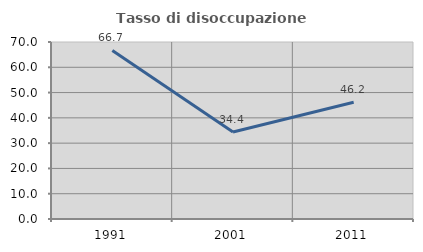
| Category | Tasso di disoccupazione giovanile  |
|---|---|
| 1991.0 | 66.667 |
| 2001.0 | 34.426 |
| 2011.0 | 46.154 |